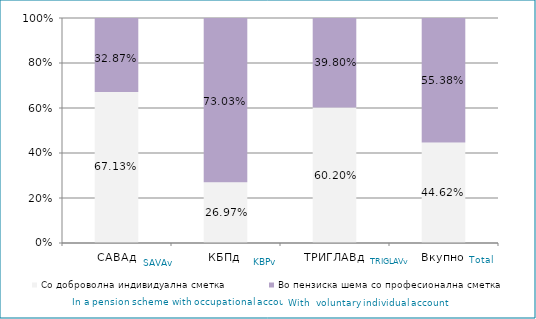
| Category | Со доброволна индивидуална сметка  | Во пензиска шема со професионална сметка |
|---|---|---|
| САВАд | 0.671 | 0.329 |
| КБПд | 0.27 | 0.73 |
| ТРИГЛАВд | 0.602 | 0.398 |
| Вкупно | 0.446 | 0.554 |